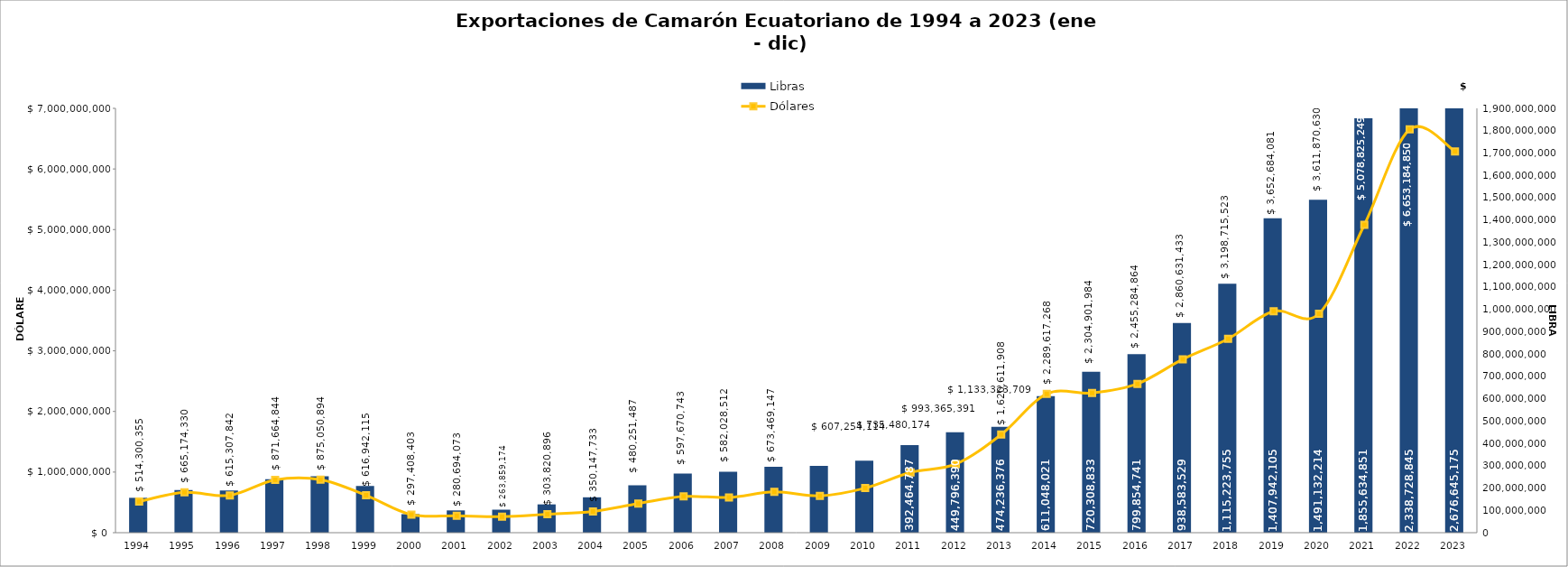
| Category | Libras  |
|---|---|
| 1994.0 | 156200837 |
| 1995.0 | 190862764 |
| 1996.0 | 188541533 |
| 1997.0 | 240004270 |
| 1998.0 | 252985907 |
| 1999.0 | 209040500 |
| 2000.0 | 82955793 |
| 2001.0 | 99801296 |
| 2002.0 | 103033746 |
| 2003.0 | 126750834 |
| 2004.0 | 158460630 |
| 2005.0 | 212575213 |
| 2006.0 | 264361763 |
| 2007.0 | 273137769 |
| 2008.0 | 294733588 |
| 2009.0 | 299333918 |
| 2010.0 | 322326680 |
| 2011.0 | 392464787 |
| 2012.0 | 449796390 |
| 2013.0 | 474236376 |
| 2014.0 | 611048021 |
| 2015.0 | 720308833 |
| 2016.0 | 799854741 |
| 2017.0 | 938583529 |
| 2018.0 | 1115223755 |
| 2019.0 | 1407942105 |
| 2020.0 | 1491132214 |
| 2021.0 | 1855634851 |
| 2022.0 | 2338728845 |
| 2023.0 | 2676645175 |